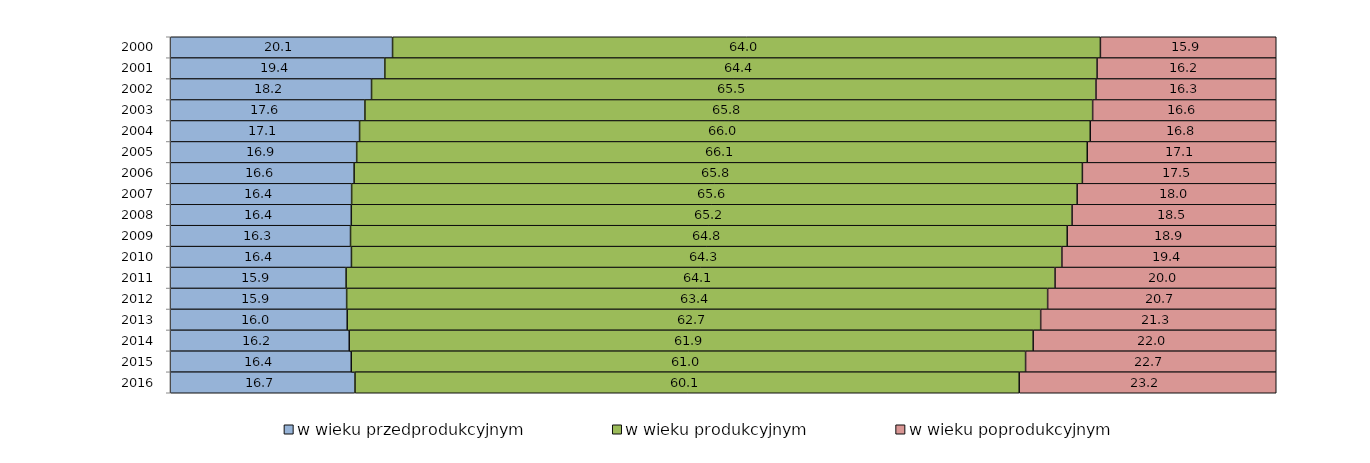
| Category | w wieku przedprodukcyjnym | w wieku produkcyjnym | w wieku poprodukcyjnym |
|---|---|---|---|
| 2000.0 | 20.1 | 64 | 15.9 |
| 2001.0 | 19.4 | 64.4 | 16.2 |
| 2002.0 | 18.2 | 65.5 | 16.3 |
| 2003.0 | 17.6 | 65.8 | 16.6 |
| 2004.0 | 17.1 | 66 | 16.8 |
| 2005.0 | 16.856 | 66.056 | 17.088 |
| 2006.0 | 16.625 | 65.847 | 17.528 |
| 2007.0 | 16.4 | 65.6 | 18 |
| 2008.0 | 16.37 | 65.17 | 18.46 |
| 2009.0 | 16.3 | 64.8 | 18.9 |
| 2010.0 | 16.4 | 64.3 | 19.4 |
| 2011.0 | 15.9 | 64.1 | 20 |
| 2012.0 | 15.949 | 63.381 | 20.67 |
| 2013.0 | 16 | 62.7 | 21.3 |
| 2014.0 | 16.2 | 61.9 | 22 |
| 2015.0 | 16.365 | 60.971 | 22.663 |
| 2016.0 | 16.704 | 60.056 | 23.24 |